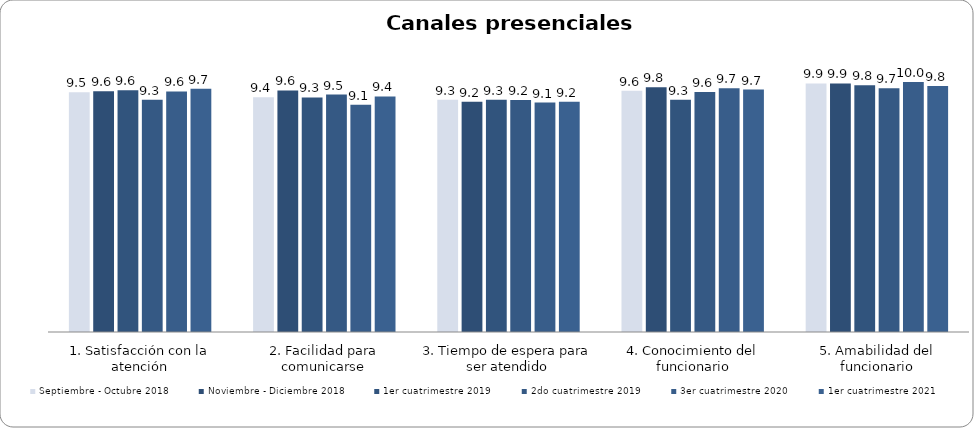
| Category | Septiembre - Octubre 2018 | Noviembre - Diciembre 2018 | 1er cuatrimestre 2019 | 2do cuatrimestre 2019 | 3er cuatrimestre 2020 | 1er cuatrimestre 2021 |
|---|---|---|---|---|---|---|
| 1. Satisfacción con la atención | 9.549 | 9.594 | 9.629 | 9.25 | 9.586 | 9.687 |
| 2. Facilidad para comunicarse | 9.354 | 9.624 | 9.343 | 9.458 | 9.057 | 9.384 |
| 3. Tiempo de espera para ser atendido | 9.256 | 9.178 | 9.257 | 9.24 | 9.143 | 9.172 |
| 4. Conocimiento del funcionario | 9.61 | 9.752 | 9.257 | 9.562 | 9.714 | 9.657 |
| 5. Amabilidad del funcionario | 9.902 | 9.901 | 9.829 | 9.708 | 9.957 | 9.798 |